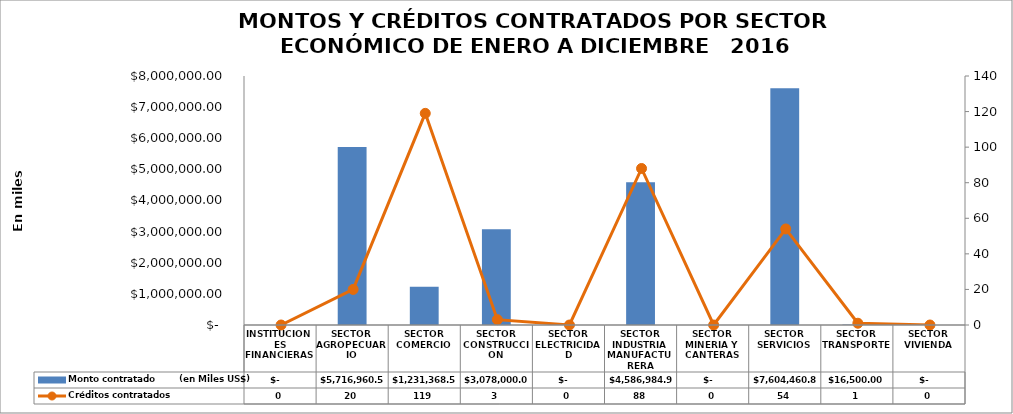
| Category | Monto contratado        (en Miles US$) |
|---|---|
| INSTITUCIONES FINANCIERAS | 0 |
| SECTOR AGROPECUARIO | 5716960.55 |
| SECTOR COMERCIO | 1231368.59 |
| SECTOR CONSTRUCCION | 3078000 |
| SECTOR ELECTRICIDAD | 0 |
| SECTOR INDUSTRIA MANUFACTURERA | 4586984.93 |
| SECTOR MINERIA Y CANTERAS | 0 |
| SECTOR SERVICIOS | 7604460.81 |
| SECTOR TRANSPORTE | 16500 |
| SECTOR VIVIENDA | 0 |